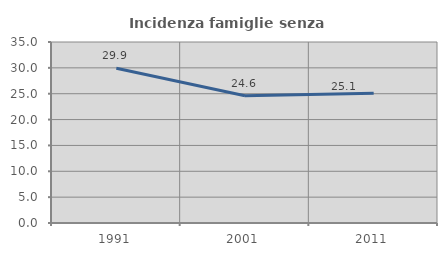
| Category | Incidenza famiglie senza nuclei |
|---|---|
| 1991.0 | 29.921 |
| 2001.0 | 24.598 |
| 2011.0 | 25.098 |